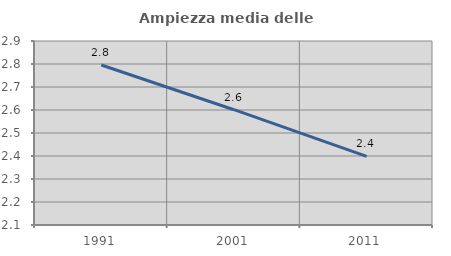
| Category | Ampiezza media delle famiglie |
|---|---|
| 1991.0 | 2.796 |
| 2001.0 | 2.601 |
| 2011.0 | 2.398 |